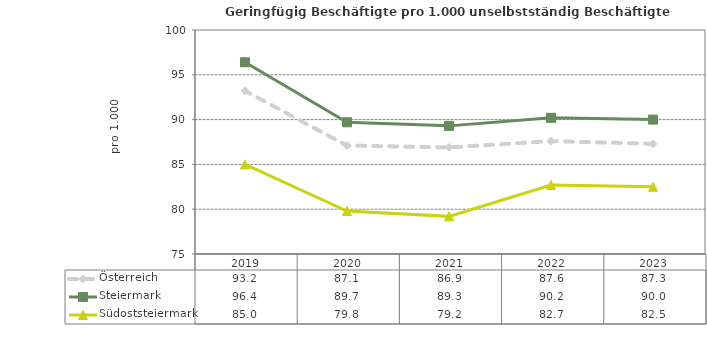
| Category | Österreich | Steiermark | Südoststeiermark |
|---|---|---|---|
| 2023.0 | 87.3 | 90 | 82.5 |
| 2022.0 | 87.6 | 90.2 | 82.7 |
| 2021.0 | 86.9 | 89.3 | 79.2 |
| 2020.0 | 87.1 | 89.7 | 79.8 |
| 2019.0 | 93.2 | 96.4 | 85 |